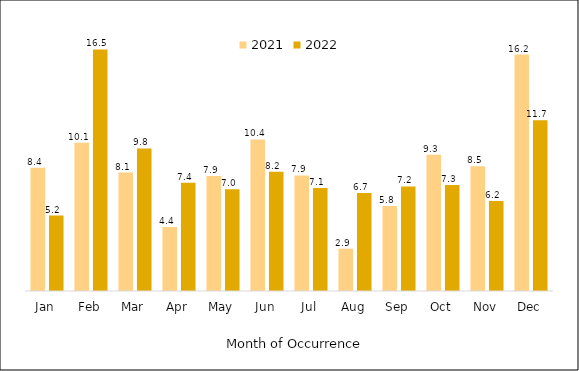
| Category | 2021 | 2022 |
|---|---|---|
| Jan | 8.444 | 5.166 |
| Feb | 10.147 | 16.533 |
| Mar | 8.105 | 9.757 |
| Apr | 4.388 | 7.408 |
| May | 7.876 | 6.962 |
| Jun | 10.377 | 8.157 |
| Jul | 7.91 | 7.055 |
| Aug | 2.898 | 6.7 |
| Sep | 5.814 | 7.154 |
| Oct | 9.319 | 7.258 |
| Nov | 8.541 | 6.16 |
| Dec | 16.183 | 11.692 |